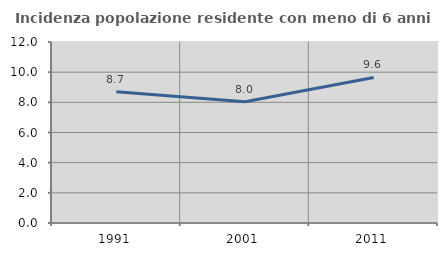
| Category | Incidenza popolazione residente con meno di 6 anni |
|---|---|
| 1991.0 | 8.696 |
| 2001.0 | 8.036 |
| 2011.0 | 9.649 |